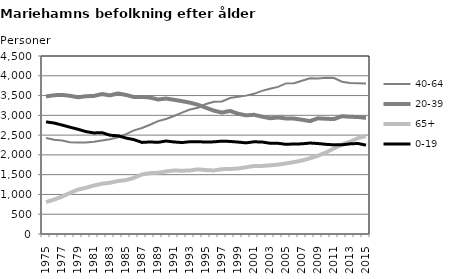
| Category | 40-64 | 20-39 | 65+ | 0-19 |
|---|---|---|---|---|
| 1975.0 | 2428 | 3478 | 809 | 2835 |
| 1976.0 | 2384 | 3508 | 868 | 2806 |
| 1977.0 | 2361 | 3517 | 946 | 2755 |
| 1978.0 | 2319 | 3494 | 1037 | 2700 |
| 1979.0 | 2311 | 3456 | 1123 | 2648 |
| 1980.0 | 2313 | 3483 | 1169 | 2588 |
| 1981.0 | 2334 | 3491 | 1226 | 2555 |
| 1982.0 | 2362 | 3538 | 1271 | 2562 |
| 1983.0 | 2394 | 3505 | 1295 | 2497 |
| 1984.0 | 2447 | 3554 | 1340 | 2483 |
| 1985.0 | 2525 | 3515 | 1363 | 2426 |
| 1986.0 | 2619 | 3464 | 1420 | 2385 |
| 1987.0 | 2679 | 3466 | 1506 | 2315 |
| 1988.0 | 2762 | 3450 | 1538 | 2327 |
| 1989.0 | 2853 | 3400 | 1547 | 2317 |
| 1990.0 | 2907 | 3424 | 1581 | 2351 |
| 1991.0 | 2984 | 3393 | 1606 | 2327 |
| 1992.0 | 3067 | 3359 | 1600 | 2312 |
| 1993.0 | 3147 | 3320 | 1606 | 2333 |
| 1994.0 | 3192 | 3267 | 1635 | 2335 |
| 1995.0 | 3288 | 3191 | 1616 | 2323 |
| 1996.0 | 3345 | 3118 | 1606 | 2330 |
| 1997.0 | 3351 | 3070 | 1639 | 2348 |
| 1998.0 | 3438 | 3112 | 1644 | 2340 |
| 1999.0 | 3470 | 3042 | 1656 | 2324 |
| 2000.0 | 3498 | 2999 | 1687 | 2304 |
| 2001.0 | 3544 | 3014 | 1720 | 2331 |
| 2002.0 | 3619 | 2967 | 1720 | 2326 |
| 2003.0 | 3670 | 2926 | 1736 | 2294 |
| 2004.0 | 3720 | 2946 | 1753 | 2293 |
| 2005.0 | 3808 | 2921 | 1784 | 2267 |
| 2006.0 | 3813 | 2917 | 1818 | 2276 |
| 2007.0 | 3876 | 2889 | 1858 | 2279 |
| 2008.0 | 3936 | 2854 | 1915 | 2300 |
| 2009.0 | 3932 | 2925 | 1979 | 2287 |
| 2010.0 | 3948 | 2913 | 2062 | 2267 |
| 2011.0 | 3941 | 2906 | 2163 | 2253 |
| 2012.0 | 3850 | 2978 | 2263 | 2255 |
| 2013.0 | 3816 | 2963 | 2335 | 2279 |
| 2014.0 | 3810 | 2959 | 2423 | 2288 |
| 2015.0 | 3803 | 2935 | 2477 | 2246 |